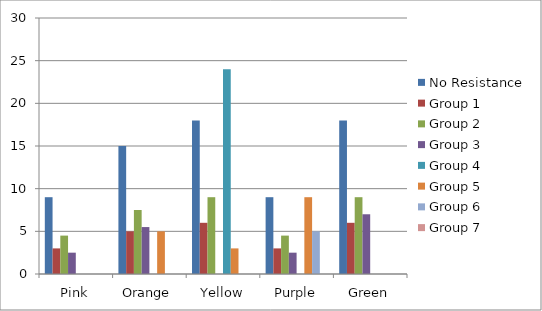
| Category | No Resistance | Group 1 | Group 2 | Group 3 | Group 4  | Group 5 | Group 6 | Group 7 |
|---|---|---|---|---|---|---|---|---|
| Pink | 9 | 3 | 4.5 | 2.5 | 0 | 0 | 0 | 0 |
| Orange | 15 | 5 | 7.5 | 5.5 | 0 | 5 | 0 | 0 |
| Yellow | 18 | 6 | 9 | 0 | 24 | 3 | 0 | 0 |
| Purple | 9 | 3 | 4.5 | 2.5 | 0 | 9 | 5 | 0 |
| Green | 18 | 6 | 9 | 7 | 0 | 0 | 0 | 0 |